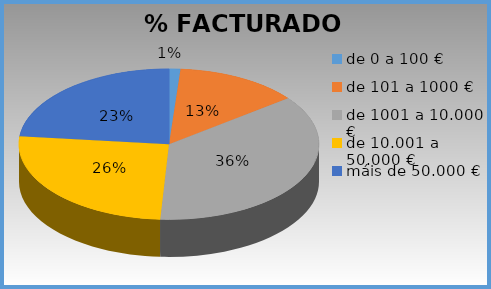
| Category | Series 0 |
|---|---|
| de 0 a 100 € | 0.012 |
| de 101 a 1000 € | 0.133 |
| de 1001 a 10.000 € | 0.364 |
| de 10.001 a 50.000 € | 0.258 |
| máis de 50.000 € | 0.233 |